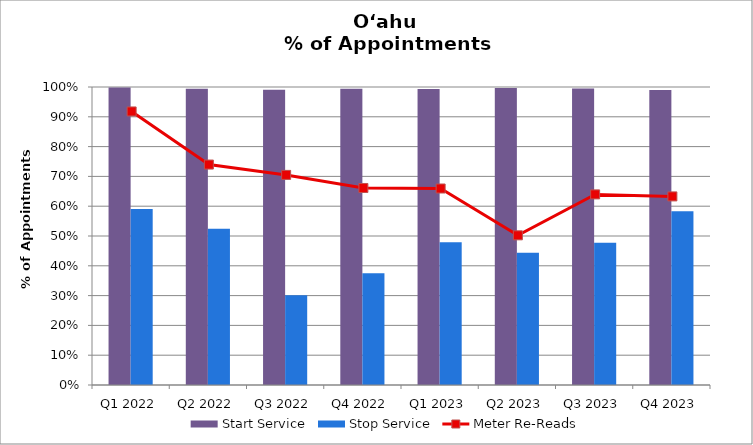
| Category | Start Service | Stop Service |
|---|---|---|
| Q1 2022 | 0.998 | 0.59 |
| Q2 2022 | 0.994 | 0.525 |
| Q3 2022 | 0.991 | 0.301 |
| Q4 2022 | 0.994 | 0.375 |
| Q1 2023 | 0.994 | 0.479 |
| Q2 2023 | 0.997 | 0.444 |
| Q3 2023 | 0.995 | 0.477 |
| Q4 2023 | 0.99 | 0.583 |